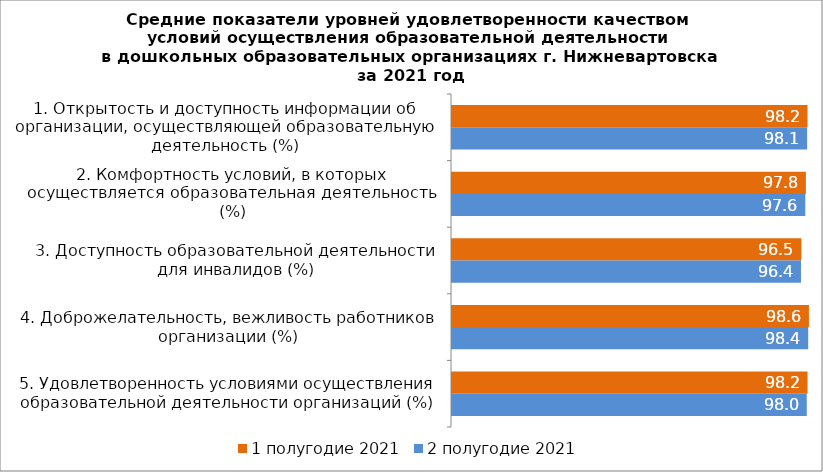
| Category | 1 полугодие 2021 | 2 полугодие 2021 |
|---|---|---|
| 1. Открытость и доступность информации об организации, осуществляющей образовательную деятельность (%) | 98.208 | 98.1 |
| 2. Комфортность условий, в которых осуществляется образовательная деятельность (%) | 97.758 | 97.6 |
| 3. Доступность образовательной деятельности для инвалидов (%) | 96.517 | 96.4 |
| 4. Доброжелательность, вежливость работников организации (%) | 98.596 | 98.4 |
| 5. Удовлетворенность условиями осуществления образовательной деятельности организаций (%) | 98.226 | 98 |